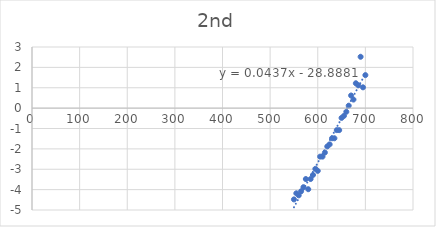
| Category | Series 0 |
|---|---|
| 550.0 | -4.48 |
| 555.0 | -4.18 |
| 560.0 | -4.28 |
| 565.0 | -4.08 |
| 570.0 | -3.88 |
| 575.0 | -3.48 |
| 580.0 | -3.98 |
| 585.0 | -3.48 |
| 590.0 | -3.28 |
| 595.0 | -2.98 |
| 600.0 | -3.08 |
| 605.0 | -2.38 |
| 610.0 | -2.38 |
| 615.0 | -2.18 |
| 620.0 | -1.88 |
| 625.0 | -1.78 |
| 630.0 | -1.48 |
| 635.0 | -1.48 |
| 640.0 | -1.08 |
| 645.0 | -1.08 |
| 650.0 | -0.48 |
| 655.0 | -0.38 |
| 660.0 | -0.18 |
| 665.0 | 0.12 |
| 670.0 | 0.62 |
| 675.0 | 0.42 |
| 680.0 | 1.22 |
| 685.0 | 1.12 |
| 690.0 | 2.52 |
| 695.0 | 1.02 |
| 700.0 | 1.62 |